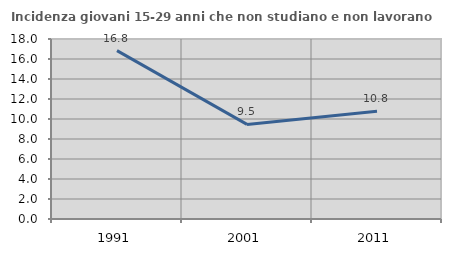
| Category | Incidenza giovani 15-29 anni che non studiano e non lavorano  |
|---|---|
| 1991.0 | 16.837 |
| 2001.0 | 9.457 |
| 2011.0 | 10.784 |